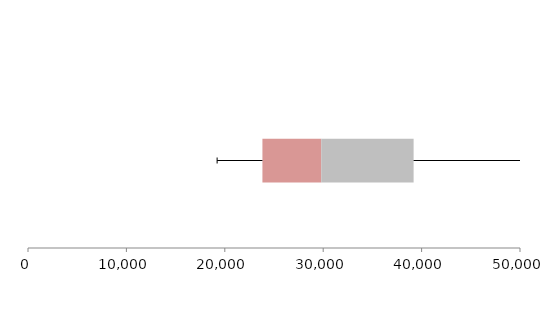
| Category | Series 1 | Series 2 | Series 3 |
|---|---|---|---|
| 0 | 23823.448 | 5977.748 | 9386.241 |